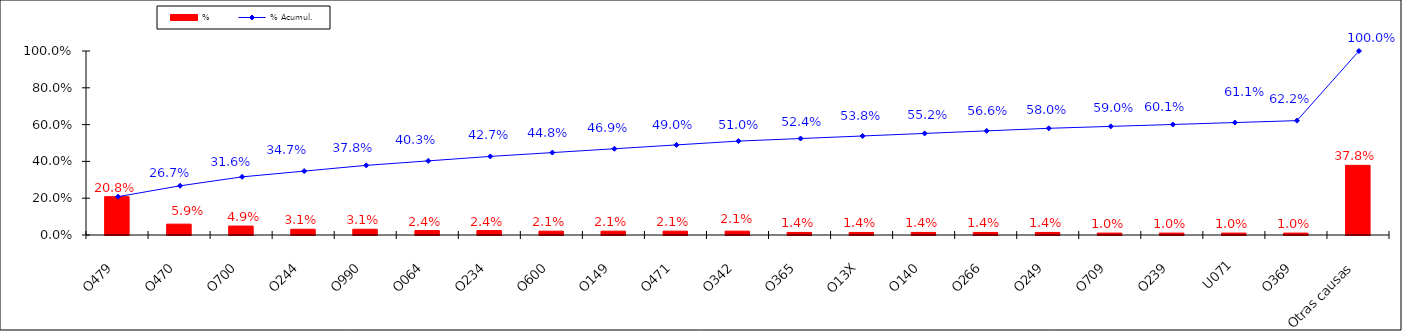
| Category | % |
|---|---|
| O479 | 0.208 |
| O470 | 0.059 |
| O700 | 0.049 |
| O244 | 0.031 |
| O990 | 0.031 |
| O064 | 0.024 |
| O234 | 0.024 |
| O600 | 0.021 |
| O149 | 0.021 |
| O471 | 0.021 |
| O342 | 0.021 |
| O365 | 0.014 |
| O13X | 0.014 |
| O140 | 0.014 |
| O266 | 0.014 |
| O249 | 0.014 |
| O709 | 0.01 |
| O239 | 0.01 |
| U071 | 0.01 |
| O369 | 0.01 |
| Otras causas | 0.378 |